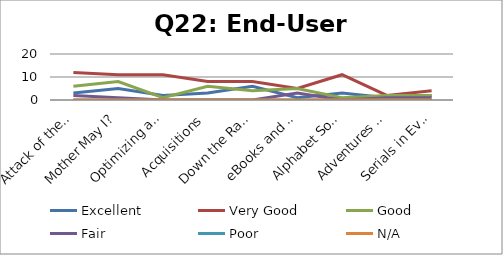
| Category | Excellent | Very Good | Good | Fair | Poor | N/A |
|---|---|---|---|---|---|---|
| Attack of the Clones | 3 | 12 | 6 | 2 | 0 | 0 |
| Mother May I? | 5 | 11 | 8 | 1 | 0 | 0 |
| Optimizing and Mobilizing Staff | 2 | 11 | 1 | 0 | 0 | 0 |
| Acquisitions | 3 | 8 | 6 | 0 | 0 | 0 |
| Down the Rabbit Hole (Part 1) | 6 | 8 | 4 | 0 | 0 | 0 |
| eBooks and Audiobooks | 1 | 5 | 5 | 3 | 0 | 0 |
| Alphabet Soup | 3 | 11 | 1 | 0 | 0 | 0 |
| Adventures with Vandelay | 1 | 2 | 2 | 1 | 0 | 0 |
| Serials in Evergreen | 2 | 4 | 2 | 1 | 0 | 0 |